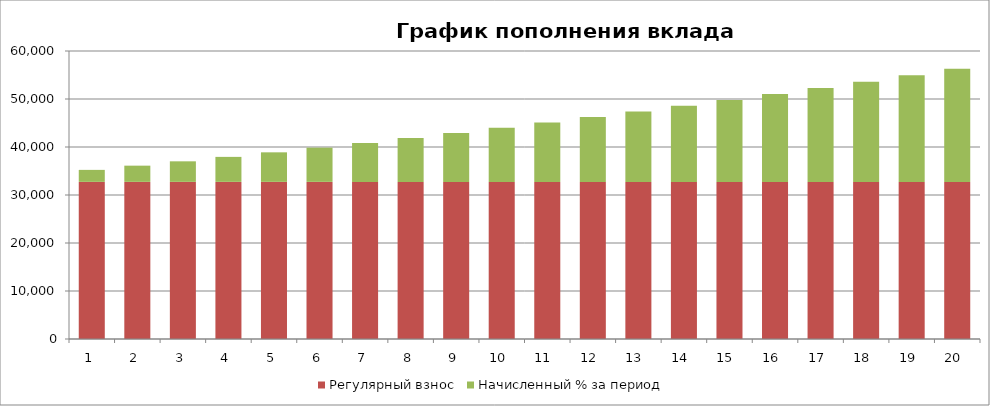
| Category | Регулярный взнос | Начисленный % за период |
|---|---|---|
| 1.0 | 32732.416 | 2500 |
| 2.0 | 32732.416 | 3380.81 |
| 3.0 | 32732.416 | 4283.641 |
| 4.0 | 32732.416 | 5209.042 |
| 5.0 | 32732.416 | 6157.579 |
| 6.0 | 32732.416 | 7129.829 |
| 7.0 | 32732.416 | 8126.385 |
| 8.0 | 32732.416 | 9147.855 |
| 9.0 | 32732.416 | 10194.862 |
| 10.0 | 32732.416 | 11268.044 |
| 11.0 | 32732.416 | 12368.055 |
| 12.0 | 32732.416 | 13495.567 |
| 13.0 | 32732.416 | 14651.266 |
| 14.0 | 32732.416 | 15835.859 |
| 15.0 | 32732.416 | 17050.065 |
| 16.0 | 32732.416 | 18294.627 |
| 17.0 | 32732.416 | 19570.304 |
| 18.0 | 32732.416 | 20877.871 |
| 19.0 | 32732.416 | 22218.129 |
| 20.0 | 32732.416 | 23591.892 |